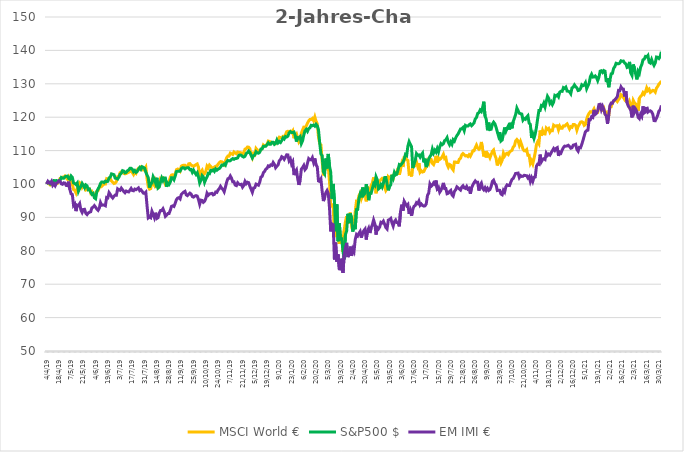
| Category | MSCI World € | S&P500 $ | EM IMI € |
|---|---|---|---|
| 2019-04-04 | 100 | 100 | 100 |
| 2019-04-05 | 100.413 | 100.482 | 100.778 |
| 2019-04-08 | 100.067 | 100.569 | 100.292 |
| 2019-04-09 | 99.679 | 100.034 | 100.222 |
| 2019-04-10 | 99.873 | 100.379 | 100.809 |
| 2019-04-11 | 99.96 | 100.36 | 99.603 |
| 2019-04-12 | 100.012 | 101.039 | 100.101 |
| 2019-04-15 | 100.135 | 100.971 | 99.475 |
| 2019-04-16 | 100.559 | 101.043 | 100.233 |
| 2019-04-17 | 100.254 | 100.796 | 100.443 |
| 2019-04-18 | 100.734 | 100.986 | 100.961 |
| 2019-04-23 | 101.698 | 101.084 | 100.805 |
| 2019-04-24 | 101.813 | 101.956 | 100.058 |
| 2019-04-25 | 102.059 | 101.756 | 99.911 |
| 2019-04-26 | 102.039 | 101.718 | 100.346 |
| 2019-04-29 | 102.376 | 102.184 | 100.284 |
| 2019-04-30 | 101.864 | 102.313 | 99.564 |
| 2019-05-02 | 101.412 | 102.377 | 99.502 |
| 2019-05-03 | 102.146 | 101.63 | 100.719 |
| 2019-05-06 | 101.285 | 101.429 | 98.359 |
| 2019-05-07 | 100.29 | 102.393 | 97.029 |
| 2019-05-08 | 99.956 | 101.987 | 96.862 |
| 2019-05-09 | 98.316 | 100.334 | 93.579 |
| 2019-05-10 | 98.124 | 100.136 | 94.027 |
| 2019-05-13 | 97.329 | 99.829 | 91.88 |
| 2019-05-14 | 98.719 | 100.296 | 93.684 |
| 2019-05-15 | 98.979 | 97.835 | 93.54 |
| 2019-05-16 | 100.401 | 98.684 | 94.135 |
| 2019-05-17 | 100.099 | 99.268 | 92.203 |
| 2019-05-20 | 99.016 | 100.178 | 91.472 |
| 2019-05-21 | 99.706 | 99.572 | 92.37 |
| 2019-05-22 | 99.607 | 98.893 | 92.42 |
| 2019-05-23 | 98.209 | 99.731 | 91.23 |
| 2019-05-24 | 98.36 | 99.458 | 90.842 |
| 2019-05-27 | 98.659 | 98.294 | 91.332 |
| 2019-05-28 | 98.578 | 98.464 | 91.549 |
| 2019-05-29 | 97.331 | 97.581 | 91.689 |
| 2019-05-30 | 97.703 | 96.91 | 92.868 |
| 2019-05-31 | 96.989 | 97.179 | 93.066 |
| 2019-06-03 | 96.43 | 95.879 | 93.525 |
| 2019-06-04 | 97.087 | 95.594 | 93.058 |
| 2019-06-05 | 97.808 | 97.698 | 92.49 |
| 2019-06-06 | 98.017 | 98.525 | 92.105 |
| 2019-06-07 | 98.911 | 99.166 | 92.732 |
| 2019-06-11 | 99.734 | 100.155 | 94.443 |
| 2019-06-12 | 99.322 | 100.626 | 93.634 |
| 2019-06-13 | 99.718 | 100.607 | 93.715 |
| 2019-06-14 | 99.952 | 100.417 | 93.673 |
| 2019-06-17 | 99.972 | 100.864 | 93.494 |
| 2019-06-18 | 101.523 | 100.713 | 95.971 |
| 2019-06-19 | 101.325 | 100.804 | 95.854 |
| 2019-06-20 | 101.718 | 101.809 | 97.422 |
| 2019-06-21 | 101.622 | 102.078 | 96.889 |
| 2019-06-24 | 100.857 | 103.029 | 96.216 |
| 2019-06-25 | 100.516 | 102.908 | 95.8 |
| 2019-06-26 | 100.143 | 102.775 | 96.309 |
| 2019-06-27 | 100.286 | 101.759 | 96.706 |
| 2019-06-28 | 100.77 | 101.661 | 96.652 |
| 2019-07-01 | 102.197 | 101.49 | 98.542 |
| 2019-07-02 | 102.32 | 102.051 | 98.266 |
| 2019-07-03 | 103.376 | 102.92 | 98.11 |
| 2019-07-04 | 103.625 | 103.219 | 98.775 |
| 2019-07-05 | 103.427 | 104.012 | 98.293 |
| 2019-07-08 | 103.205 | 103.879 | 97.752 |
| 2019-07-09 | 103.038 | 103.359 | 97.383 |
| 2019-07-10 | 103.126 | 103.488 | 97.904 |
| 2019-07-11 | 103.34 | 103.97 | 97.713 |
| 2019-07-12 | 103.502 | 104.178 | 97.616 |
| 2019-07-15 | 103.685 | 104.69 | 98.126 |
| 2019-07-16 | 104.014 | 104.717 | 98.674 |
| 2019-07-17 | 103.447 | 104.376 | 98.059 |
| 2019-07-18 | 102.832 | 103.67 | 97.974 |
| 2019-07-19 | 103.57 | 104.049 | 98.487 |
| 2019-07-22 | 103.221 | 103.492 | 98.293 |
| 2019-07-23 | 104.224 | 103.742 | 98.534 |
| 2019-07-24 | 104.665 | 104.455 | 98.829 |
| 2019-07-25 | 104.387 | 104.937 | 98.017 |
| 2019-07-26 | 105.061 | 104.425 | 98.297 |
| 2019-07-29 | 104.827 | 105.172 | 97.818 |
| 2019-07-30 | 104.22 | 104.982 | 97.254 |
| 2019-07-31 | 104.407 | 104.728 | 97.196 |
| 2019-08-01 | 105.037 | 103.541 | 97.55 |
| 2019-08-02 | 101.646 | 102.673 | 93.517 |
| 2019-08-05 | 99.163 | 101.922 | 89.838 |
| 2019-08-06 | 98.451 | 98.916 | 90.114 |
| 2019-08-07 | 98.618 | 100.19 | 89.893 |
| 2019-08-08 | 100.766 | 100.258 | 91.857 |
| 2019-08-09 | 100.143 | 102.214 | 91.001 |
| 2019-08-12 | 99.56 | 101.501 | 89.951 |
| 2019-08-13 | 100.75 | 100.311 | 91.398 |
| 2019-08-14 | 99.187 | 101.865 | 89.683 |
| 2019-08-15 | 98.989 | 98.798 | 89.932 |
| 2019-08-16 | 100.444 | 99.109 | 91.3 |
| 2019-08-19 | 101.634 | 100.561 | 92.039 |
| 2019-08-20 | 101.317 | 101.797 | 92.051 |
| 2019-08-21 | 101.801 | 101.009 | 92.599 |
| 2019-08-22 | 101.468 | 101.828 | 91.693 |
| 2019-08-23 | 99.873 | 101.79 | 90.309 |
| 2019-08-26 | 100.083 | 99.177 | 90.643 |
| 2019-08-27 | 100.567 | 100.277 | 91.164 |
| 2019-08-28 | 100.631 | 99.882 | 91.176 |
| 2019-08-29 | 102.051 | 100.576 | 92.164 |
| 2019-08-30 | 102.685 | 101.884 | 93.311 |
| 2019-09-02 | 102.765 | 101.843 | 93.467 |
| 2019-09-03 | 102.527 | 101.278 | 93.28 |
| 2019-09-04 | 103.026 | 102.362 | 94.221 |
| 2019-09-05 | 104.288 | 103.716 | 95.294 |
| 2019-09-06 | 104.478 | 103.792 | 95.784 |
| 2019-09-09 | 104.419 | 103.818 | 95.917 |
| 2019-09-10 | 103.923 | 103.841 | 95.536 |
| 2019-09-11 | 105.335 | 104.588 | 96.912 |
| 2019-09-12 | 105.557 | 104.895 | 97.282 |
| 2019-09-13 | 105.617 | 104.868 | 97.585 |
| 2019-09-16 | 105.621 | 104.523 | 97.803 |
| 2019-09-17 | 105.287 | 104.808 | 96.764 |
| 2019-09-18 | 105.113 | 104.872 | 96.516 |
| 2019-09-19 | 106.037 | 104.849 | 96.889 |
| 2019-09-20 | 106.116 | 104.288 | 97.274 |
| 2019-09-23 | 105.632 | 104.36 | 96.998 |
| 2019-09-24 | 105.494 | 103.496 | 96.228 |
| 2019-09-25 | 105.256 | 104.129 | 96.08 |
| 2019-09-26 | 105.561 | 103.431 | 96.387 |
| 2019-09-27 | 105.811 | 102.851 | 96.512 |
| 2019-09-30 | 106.001 | 103.359 | 96.383 |
| 2019-10-01 | 105.065 | 102.116 | 95.407 |
| 2019-10-02 | 102.221 | 100.315 | 93.941 |
| 2019-10-04 | 103.677 | 101.111 | 95.162 |
| 2019-10-07 | 104.149 | 102.514 | 95.084 |
| 2019-10-08 | 102.804 | 102.074 | 94.52 |
| 2019-10-09 | 103.074 | 100.489 | 94.839 |
| 2019-10-10 | 103.824 | 101.426 | 95.672 |
| 2019-10-11 | 105.339 | 102.116 | 97.258 |
| 2019-10-14 | 104.807 | 103.181 | 96.656 |
| 2019-10-15 | 105.648 | 103.086 | 97.021 |
| 2019-10-16 | 105.248 | 104.084 | 97.107 |
| 2019-10-17 | 104.915 | 103.921 | 97.2 |
| 2019-10-18 | 104.502 | 104.201 | 96.741 |
| 2019-10-21 | 105.069 | 103.773 | 96.897 |
| 2019-10-22 | 105.311 | 104.497 | 97.593 |
| 2019-10-23 | 105.315 | 104.129 | 97.492 |
| 2019-10-24 | 105.922 | 104.436 | 98.219 |
| 2019-10-25 | 106.354 | 104.607 | 98.619 |
| 2019-10-28 | 106.699 | 105.043 | 99.3 |
| 2019-10-29 | 106.695 | 105.653 | 98.701 |
| 2019-10-30 | 106.39 | 105.585 | 98.351 |
| 2019-10-31 | 105.906 | 105.957 | 97.674 |
| 2019-11-01 | 106.834 | 105.615 | 99.055 |
| 2019-11-04 | 107.846 | 106.62 | 100.541 |
| 2019-11-05 | 108.377 | 107.045 | 101.583 |
| 2019-11-06 | 108.353 | 106.908 | 101.684 |
| 2019-11-07 | 109.246 | 106.965 | 102.407 |
| 2019-11-08 | 109.04 | 107.344 | 101.754 |
| 2019-11-11 | 108.845 | 107.606 | 100.661 |
| 2019-11-12 | 109.583 | 107.397 | 100.665 |
| 2019-11-13 | 109.313 | 107.61 | 99.673 |
| 2019-11-14 | 109.067 | 107.655 | 99.518 |
| 2019-11-15 | 109.579 | 107.799 | 100.373 |
| 2019-11-18 | 109.476 | 108.603 | 99.969 |
| 2019-11-19 | 109.417 | 108.671 | 99.825 |
| 2019-11-20 | 109.305 | 108.618 | 99.926 |
| 2019-11-21 | 108.79 | 108.235 | 99.051 |
| 2019-11-22 | 109.313 | 108.069 | 99.572 |
| 2019-11-25 | 110.44 | 108.307 | 100.774 |
| 2019-11-26 | 110.587 | 109.13 | 100.093 |
| 2019-11-27 | 111.078 | 109.35 | 100.529 |
| 2019-11-28 | 111.031 | 109.866 | 100.401 |
| 2019-11-29 | 110.567 | 109.445 | 99.296 |
| 2019-12-02 | 108.762 | 108.554 | 98.409 |
| 2019-12-03 | 107.862 | 107.792 | 97.511 |
| 2019-12-04 | 109.151 | 108.482 | 98.818 |
| 2019-12-05 | 108.814 | 108.683 | 98.919 |
| 2019-12-06 | 110.654 | 109.65 | 99.969 |
| 2019-12-09 | 110.222 | 109.316 | 99.806 |
| 2019-12-10 | 109.762 | 109.214 | 99.638 |
| 2019-12-11 | 109.849 | 109.498 | 100.513 |
| 2019-12-12 | 110.368 | 110.461 | 102.069 |
| 2019-12-13 | 110.591 | 110.503 | 102.291 |
| 2019-12-16 | 111.673 | 111.284 | 103.387 |
| 2019-12-17 | 111.34 | 111.307 | 103.78 |
| 2019-12-18 | 111.634 | 111.314 | 104.457 |
| 2019-12-19 | 111.769 | 111.777 | 104.69 |
| 2019-12-20 | 112.848 | 112.345 | 105.413 |
| 2019-12-23 | 112.729 | 111.913 | 105.254 |
| 2019-12-27 | 112.578 | 111.913 | 105.732 |
| 2019-12-30 | 112.268 | 112.486 | 105.6 |
| 2020-01-02 | 112.451 | 112.486 | 106.448 |
| 2020-01-03 | 112.411 | 111.868 | 105.907 |
| 2020-01-06 | 112.153 | 112.156 | 104.865 |
| 2020-01-07 | 112.852 | 113.149 | 105.308 |
| 2020-01-08 | 113.316 | 112.323 | 105.682 |
| 2020-01-09 | 114.03 | 112.744 | 106.938 |
| 2020-01-10 | 113.915 | 112.433 | 107.37 |
| 2020-01-13 | 113.78 | 113.013 | 108.178 |
| 2020-01-14 | 114.268 | 113.794 | 107.957 |
| 2020-01-15 | 114.224 | 113.468 | 107.385 |
| 2020-01-16 | 114.724 | 114.219 | 108.038 |
| 2020-01-17 | 115.636 | 114.067 | 108.735 |
| 2020-01-20 | 115.791 | 114.321 | 108.715 |
| 2020-01-21 | 115.604 | 115.276 | 106.973 |
| 2020-01-22 | 115.815 | 115.667 | 107.529 |
| 2020-01-23 | 115.438 | 115.428 | 105.97 |
| 2020-01-24 | 115.961 | 115.458 | 106.658 |
| 2020-01-27 | 113.685 | 115.572 | 102.672 |
| 2020-01-28 | 114.656 | 114.518 | 103.679 |
| 2020-01-29 | 115.045 | 112.698 | 104.231 |
| 2020-01-30 | 113.736 | 113.919 | 101.668 |
| 2020-01-31 | 112.554 | 113.805 | 99.732 |
| 2020-02-03 | 113.101 | 114.162 | 101.081 |
| 2020-02-04 | 115.204 | 112.114 | 104.437 |
| 2020-02-05 | 116.175 | 112.929 | 104.931 |
| 2020-02-06 | 117.024 | 114.67 | 105.553 |
| 2020-02-07 | 117.008 | 115.966 | 104.293 |
| 2020-02-10 | 117.369 | 116.361 | 104.752 |
| 2020-02-11 | 118.194 | 115.769 | 106.215 |
| 2020-02-12 | 118.877 | 116.6 | 107.603 |
| 2020-02-13 | 119.333 | 116.812 | 107.268 |
| 2020-02-14 | 119.313 | 117.563 | 107.226 |
| 2020-02-17 | 119.61 | 117.449 | 107.898 |
| 2020-02-18 | 118.952 | 117.646 | 106.479 |
| 2020-02-19 | 120.09 | 117.324 | 107.661 |
| 2020-02-20 | 118.789 | 117.889 | 105.678 |
| 2020-02-21 | 118.032 | 117.426 | 105.153 |
| 2020-02-24 | 114.045 | 116.209 | 100.91 |
| 2020-02-25 | 112.102 | 112.323 | 100.751 |
| 2020-02-26 | 111.725 | 108.948 | 101.439 |
| 2020-02-27 | 106.953 | 108.467 | 97.83 |
| 2020-02-28 | 102.558 | 103.659 | 94.894 |
| 2020-03-02 | 103.998 | 103.033 | 95.843 |
| 2020-03-03 | 104.847 | 107.633 | 97.437 |
| 2020-03-04 | 105.831 | 104.664 | 98.059 |
| 2020-03-05 | 105.156 | 109.001 | 97.149 |
| 2020-03-06 | 100.615 | 105.35 | 92.821 |
| 2020-03-09 | 93.61 | 103.583 | 85.813 |
| 2020-03-10 | 93.34 | 95.59 | 88.065 |
| 2020-03-11 | 93.757 | 100.027 | 87.812 |
| 2020-03-12 | 84.713 | 95.067 | 77.396 |
| 2020-03-13 | 86.655 | 85.872 | 82.457 |
| 2020-03-16 | 84.134 | 93.896 | 76.719 |
| 2020-03-17 | 85.34 | 82.873 | 78.945 |
| 2020-03-18 | 82.063 | 88.299 | 74.592 |
| 2020-03-19 | 84.36 | 83.472 | 74.522 |
| 2020-03-20 | 84.368 | 83.544 | 77.662 |
| 2020-03-23 | 79.701 | 79.904 | 73.386 |
| 2020-03-24 | 86.252 | 77.451 | 78.887 |
| 2020-03-25 | 88.662 | 84.837 | 80.793 |
| 2020-03-26 | 90.357 | 85.926 | 82.364 |
| 2020-03-27 | 88.17 | 91.09 | 78.117 |
| 2020-03-30 | 89.862 | 88.291 | 79.132 |
| 2020-03-31 | 91.446 | 91.147 | 81.271 |
| 2020-04-01 | 87.755 | 89.793 | 78.463 |
| 2020-04-02 | 88.372 | 85.747 | 80.52 |
| 2020-04-03 | 87.966 | 87.753 | 79.778 |
| 2020-04-06 | 91.797 | 86.456 | 83.367 |
| 2020-04-07 | 94.772 | 92.337 | 84.849 |
| 2020-04-08 | 94.58 | 92.386 | 84.46 |
| 2020-04-09 | 96.488 | 95.522 | 85.238 |
| 2020-04-14 | 97.192 | 96.94 | 85.79 |
| 2020-04-15 | 95.583 | 96 | 83.919 |
| 2020-04-16 | 96.644 | 98.931 | 85.436 |
| 2020-04-17 | 98.005 | 96.777 | 86.012 |
| 2020-04-20 | 98.975 | 97.266 | 86.498 |
| 2020-04-21 | 94.816 | 99.951 | 83.371 |
| 2020-04-22 | 96.962 | 98.15 | 86 |
| 2020-04-23 | 98.269 | 95.151 | 86.785 |
| 2020-04-24 | 97.473 | 97.243 | 85.335 |
| 2020-04-27 | 99.627 | 97.225 | 86.832 |
| 2020-04-28 | 100.373 | 98.635 | 87.851 |
| 2020-04-29 | 101.979 | 100.061 | 89.235 |
| 2020-04-30 | 100.266 | 99.598 | 88.077 |
| 2020-05-04 | 97.212 | 102.165 | 84.853 |
| 2020-05-05 | 100.147 | 101.274 | 86.941 |
| 2020-05-06 | 99.738 | 98.514 | 86.56 |
| 2020-05-07 | 100.853 | 98.825 | 87.12 |
| 2020-05-08 | 101.361 | 99.735 | 88.543 |
| 2020-05-11 | 101.718 | 99.063 | 88.368 |
| 2020-05-12 | 101.495 | 100.235 | 88.885 |
| 2020-05-13 | 99.127 | 101.911 | 87.979 |
| 2020-05-14 | 98.033 | 101.926 | 86.949 |
| 2020-05-15 | 98.606 | 99.875 | 86.548 |
| 2020-05-18 | 102.182 | 98.104 | 89.193 |
| 2020-05-19 | 101.817 | 99.287 | 89.34 |
| 2020-05-20 | 102.217 | 99.735 | 89.698 |
| 2020-05-21 | 101.301 | 102.783 | 88.392 |
| 2020-05-22 | 101.424 | 101.812 | 87.384 |
| 2020-05-25 | 103.431 | 103.473 | 88.745 |
| 2020-05-26 | 103.491 | 102.73 | 89.216 |
| 2020-05-27 | 103.193 | 102.961 | 88.462 |
| 2020-05-28 | 104.744 | 104.285 | 88.36 |
| 2020-05-29 | 102.765 | 105.805 | 87.318 |
| 2020-06-02 | 104.49 | 105.596 | 91.775 |
| 2020-06-03 | 106.132 | 106.07 | 93.828 |
| 2020-06-04 | 105.093 | 106.533 | 92.016 |
| 2020-06-05 | 108 | 107.409 | 94.8 |
| 2020-06-08 | 108.088 | 108.827 | 94.104 |
| 2020-06-09 | 107.287 | 108.55 | 93.482 |
| 2020-06-10 | 107.045 | 111.326 | 93.883 |
| 2020-06-11 | 102.991 | 112.675 | 91.048 |
| 2020-06-12 | 103.161 | 111.875 | 92.094 |
| 2020-06-15 | 102.257 | 111.178 | 90.468 |
| 2020-06-16 | 105.609 | 104.77 | 92.44 |
| 2020-06-17 | 106.279 | 106.032 | 93.33 |
| 2020-06-18 | 105.791 | 106.999 | 93.575 |
| 2020-06-19 | 106.64 | 109.092 | 94.412 |
| 2020-06-22 | 105.299 | 108.592 | 94.139 |
| 2020-06-23 | 106.263 | 108.69 | 94.902 |
| 2020-06-24 | 103.51 | 108.05 | 93.599 |
| 2020-06-25 | 103.947 | 108.766 | 93.999 |
| 2020-06-26 | 103.594 | 109.259 | 93.568 |
| 2020-06-29 | 103.732 | 106.465 | 93.389 |
| 2020-06-30 | 104.514 | 107.591 | 93.47 |
| 2020-07-01 | 105.156 | 105.069 | 94.058 |
| 2020-07-02 | 106.795 | 106.051 | 96.589 |
| 2020-07-03 | 106.077 | 107.466 | 97.254 |
| 2020-07-06 | 107.54 | 108.201 | 100 |
| 2020-07-07 | 107.374 | 108.747 | 99.319 |
| 2020-07-08 | 106.172 | 110.435 | 99.666 |
| 2020-07-09 | 105.795 | 109.289 | 100.342 |
| 2020-07-10 | 106.783 | 110.101 | 99.922 |
| 2020-07-13 | 108.433 | 109.54 | 101.05 |
| 2020-07-14 | 106.446 | 110.639 | 98.549 |
| 2020-07-15 | 107.822 | 109.638 | 98.95 |
| 2020-07-16 | 107.338 | 111.106 | 97.538 |
| 2020-07-17 | 107.616 | 112.091 | 98.102 |
| 2020-07-20 | 108.179 | 111.765 | 99.109 |
| 2020-07-21 | 108.905 | 112.061 | 100.327 |
| 2020-07-22 | 107.62 | 112.994 | 98.654 |
| 2020-07-23 | 107.874 | 113.229 | 98.647 |
| 2020-07-24 | 105.878 | 113.874 | 97.083 |
| 2020-07-27 | 105.049 | 112.512 | 97.219 |
| 2020-07-28 | 105.855 | 111.784 | 97.729 |
| 2020-07-29 | 105.648 | 112.6 | 98.087 |
| 2020-07-30 | 104.661 | 111.902 | 96.761 |
| 2020-07-31 | 104.185 | 113.255 | 96.364 |
| 2020-08-03 | 106.565 | 112.842 | 97.776 |
| 2020-08-04 | 106.573 | 113.786 | 98.25 |
| 2020-08-05 | 106.426 | 114.503 | 99.148 |
| 2020-08-06 | 106.434 | 114.984 | 98.849 |
| 2020-08-07 | 107.405 | 115.701 | 98.511 |
| 2020-08-10 | 107.727 | 116.478 | 98.188 |
| 2020-08-11 | 108.758 | 116.539 | 99.082 |
| 2020-08-12 | 109.111 | 116.911 | 99.479 |
| 2020-08-13 | 108.806 | 115.966 | 98.837 |
| 2020-08-14 | 108.413 | 117.555 | 98.674 |
| 2020-08-17 | 108.504 | 117.354 | 99.265 |
| 2020-08-18 | 108.207 | 117.354 | 98.468 |
| 2020-08-19 | 108.754 | 117.733 | 98.705 |
| 2020-08-20 | 108.302 | 117.98 | 97.083 |
| 2020-08-21 | 109.032 | 117.479 | 98.857 |
| 2020-08-24 | 109.94 | 117.851 | 99.677 |
| 2020-08-25 | 109.96 | 118.272 | 100.381 |
| 2020-08-26 | 110.86 | 119.474 | 100.914 |
| 2020-08-27 | 111.654 | 119.891 | 100.502 |
| 2020-08-28 | 110.765 | 121.115 | 100.506 |
| 2020-08-31 | 110.396 | 121.358 | 98.028 |
| 2020-09-01 | 110.761 | 122.147 | 99.669 |
| 2020-09-02 | 112.59 | 121.718 | 100.261 |
| 2020-09-03 | 110.527 | 122.856 | 98.709 |
| 2020-09-04 | 108.242 | 124.645 | 98.25 |
| 2020-09-07 | 109.825 | 120.331 | 98.888 |
| 2020-09-08 | 107.953 | 119.368 | 98.094 |
| 2020-09-09 | 109.182 | 116.088 | 98.709 |
| 2020-09-10 | 108.683 | 118.378 | 98.059 |
| 2020-09-11 | 107.842 | 116.308 | 98.347 |
| 2020-09-14 | 108.826 | 116.395 | 99.288 |
| 2020-09-15 | 109.777 | 117.908 | 100.766 |
| 2020-09-16 | 110.178 | 118.514 | 101.136 |
| 2020-09-17 | 108.627 | 118.037 | 100.152 |
| 2020-09-18 | 107.751 | 117.005 | 99.774 |
| 2020-09-21 | 105.553 | 115.644 | 98.048 |
| 2020-09-22 | 106.739 | 114.389 | 98.118 |
| 2020-09-23 | 107.576 | 115.546 | 98.098 |
| 2020-09-24 | 106.279 | 112.869 | 97.002 |
| 2020-09-25 | 107.096 | 113.18 | 96.776 |
| 2020-09-28 | 109.238 | 114.992 | 98.122 |
| 2020-09-29 | 108.389 | 116.918 | 97.589 |
| 2020-09-30 | 109.016 | 115.758 | 99.141 |
| 2020-10-01 | 109.218 | 116.649 | 99.755 |
| 2020-10-02 | 108.845 | 117.388 | 99.564 |
| 2020-10-05 | 109.555 | 116.296 | 99.529 |
| 2020-10-06 | 109.869 | 118.329 | 100.521 |
| 2020-10-07 | 110.083 | 116.676 | 101.361 |
| 2020-10-08 | 111.063 | 118.677 | 101.664 |
| 2020-10-09 | 111.439 | 119.728 | 102.427 |
| 2020-10-12 | 112.927 | 120.793 | 103.166 |
| 2020-10-13 | 113.328 | 122.742 | 103.197 |
| 2020-10-14 | 112.875 | 121.957 | 103.274 |
| 2020-10-15 | 111.638 | 121.195 | 101.948 |
| 2020-10-16 | 112.709 | 121.051 | 102.532 |
| 2020-10-19 | 111.666 | 120.949 | 102.271 |
| 2020-10-20 | 110.424 | 119.121 | 102.302 |
| 2020-10-21 | 109.932 | 119.591 | 102.606 |
| 2020-10-22 | 109.908 | 119.375 | 102.52 |
| 2020-10-23 | 110.305 | 120.031 | 102.481 |
| 2020-10-26 | 108.584 | 120.441 | 101.824 |
| 2020-10-27 | 108.584 | 118.222 | 102.252 |
| 2020-10-28 | 106.196 | 117.832 | 100.747 |
| 2020-10-29 | 106.969 | 113.775 | 101.82 |
| 2020-10-30 | 106.025 | 114.973 | 100.805 |
| 2020-11-02 | 107.636 | 113.68 | 102.034 |
| 2020-11-03 | 109.46 | 115.003 | 102.104 |
| 2020-11-04 | 111.856 | 117.032 | 105.371 |
| 2020-11-05 | 112.637 | 119.667 | 105.966 |
| 2020-11-06 | 112.03 | 122.01 | 105.853 |
| 2020-11-09 | 116.013 | 121.995 | 108.797 |
| 2020-11-10 | 114.414 | 123.516 | 106.662 |
| 2020-11-11 | 116.001 | 123.356 | 107.315 |
| 2020-11-12 | 115.029 | 124.225 | 107.556 |
| 2020-11-13 | 114.974 | 123.076 | 107.331 |
| 2020-11-16 | 116.731 | 124.748 | 109.201 |
| 2020-11-17 | 116.334 | 126.261 | 108.556 |
| 2020-11-18 | 116.64 | 125.631 | 108.937 |
| 2020-11-19 | 115.537 | 124.107 | 108.649 |
| 2020-11-20 | 116.088 | 124.627 | 109.361 |
| 2020-11-23 | 115.993 | 123.792 | 109.987 |
| 2020-11-24 | 117.607 | 124.524 | 110.621 |
| 2020-11-25 | 117.302 | 126.541 | 110.057 |
| 2020-11-26 | 117.421 | 126.333 | 110.644 |
| 2020-11-27 | 117.461 | 126.693 | 110.885 |
| 2020-11-30 | 116.195 | 126.124 | 108.451 |
| 2020-12-01 | 117.314 | 127.512 | 109.528 |
| 2020-12-02 | 116.679 | 127.781 | 109.267 |
| 2020-12-03 | 116.691 | 127.743 | 110.177 |
| 2020-12-04 | 117.397 | 128.843 | 110.928 |
| 2020-12-07 | 117.342 | 128.604 | 111.34 |
| 2020-12-08 | 117.726 | 128.976 | 111.328 |
| 2020-12-09 | 118.008 | 127.83 | 111.406 |
| 2020-12-10 | 117.278 | 127.77 | 111.585 |
| 2020-12-11 | 116.481 | 127.607 | 111.239 |
| 2020-12-14 | 117.163 | 127.023 | 110.726 |
| 2020-12-15 | 116.993 | 128.778 | 110.85 |
| 2020-12-16 | 117.83 | 128.976 | 111.636 |
| 2020-12-17 | 117.837 | 129.677 | 111.713 |
| 2020-12-18 | 117.508 | 129.158 | 111.885 |
| 2020-12-21 | 116.112 | 128.759 | 110.341 |
| 2020-12-22 | 117.246 | 127.982 | 109.82 |
| 2020-12-23 | 117.826 | 128.084 | 110.94 |
| 2020-12-28 | 118.528 | 128.596 | 110.854 |
| 2020-12-29 | 118.639 | 129.715 | 111.877 |
| 2020-12-30 | 118.424 | 129.442 | 113.067 |
| 2021-01-04 | 117.556 | 129.616 | 114.42 |
| 2021-01-05 | 117.83 | 130.314 | 115.665 |
| 2021-01-06 | 119.468 | 128.547 | 115.987 |
| 2021-01-07 | 120.523 | 129.393 | 116.116 |
| 2021-01-08 | 121.193 | 130.177 | 119.27 |
| 2021-01-11 | 121.641 | 132.123 | 119.254 |
| 2021-01-12 | 121.538 | 132.866 | 120.125 |
| 2021-01-13 | 121.852 | 131.997 | 119.927 |
| 2021-01-14 | 122.494 | 132.009 | 122.198 |
| 2021-01-15 | 121.419 | 132.339 | 120.849 |
| 2021-01-18 | 121.681 | 131.891 | 121.156 |
| 2021-01-19 | 121.55 | 130.951 | 121.906 |
| 2021-01-20 | 123.125 | 131.986 | 123.781 |
| 2021-01-21 | 123.061 | 133.779 | 123.878 |
| 2021-01-22 | 122.216 | 133.905 | 122.291 |
| 2021-01-25 | 122.066 | 133.427 | 123.283 |
| 2021-01-26 | 122.629 | 133.969 | 122.404 |
| 2021-01-27 | 121.138 | 133.768 | 120.856 |
| 2021-01-28 | 121.403 | 130.522 | 120.429 |
| 2021-01-29 | 118.928 | 131.618 | 118.014 |
| 2021-02-01 | 120.483 | 128.983 | 120.611 |
| 2021-02-02 | 123.073 | 131.103 | 123.547 |
| 2021-02-03 | 123.117 | 132.987 | 124.24 |
| 2021-02-04 | 124.319 | 133.12 | 124.177 |
| 2021-02-05 | 124.707 | 134.61 | 124.951 |
| 2021-02-08 | 125.179 | 135.148 | 125.196 |
| 2021-02-09 | 125.14 | 136.145 | 125.648 |
| 2021-02-10 | 124.688 | 136.035 | 126.157 |
| 2021-02-11 | 125.255 | 135.982 | 128.012 |
| 2021-02-12 | 125.687 | 136.202 | 127.95 |
| 2021-02-15 | 126.754 | 136.896 | 129.081 |
| 2021-02-16 | 126.484 | 136.767 | 128.506 |
| 2021-02-17 | 125.901 | 136.798 | 128.42 |
| 2021-02-18 | 125.259 | 136.214 | 126.204 |
| 2021-02-19 | 125.731 | 135.963 | 127.748 |
| 2021-02-22 | 124.513 | 134.894 | 124.314 |
| 2021-02-23 | 123.593 | 135.065 | 123.337 |
| 2021-02-24 | 124.656 | 136.559 | 122.82 |
| 2021-02-25 | 123.498 | 133.283 | 122.039 |
| 2021-02-26 | 122.74 | 132.551 | 119.919 |
| 2021-03-01 | 125.049 | 135.785 | 123.442 |
| 2021-03-02 | 124.307 | 134.735 | 121.506 |
| 2021-03-03 | 123.954 | 132.957 | 122.377 |
| 2021-03-04 | 123.161 | 131.319 | 121.696 |
| 2021-03-05 | 121.911 | 133.726 | 119.97 |
| 2021-03-08 | 125.652 | 133.07 | 119.569 |
| 2021-03-09 | 126.203 | 134.932 | 120.915 |
| 2021-03-10 | 126.584 | 135.766 | 120.246 |
| 2021-03-11 | 127.357 | 137.2 | 123.244 |
| 2021-03-12 | 126.873 | 137.393 | 121.296 |
| 2021-03-15 | 127.583 | 138.189 | 121.576 |
| 2021-03-16 | 128.797 | 138.034 | 123.065 |
| 2021-03-17 | 127.984 | 138.485 | 121.541 |
| 2021-03-18 | 128.384 | 136.449 | 121.821 |
| 2021-03-19 | 127.44 | 136.206 | 121.91 |
| 2021-03-22 | 127.734 | 137.283 | 121.626 |
| 2021-03-23 | 128.051 | 136.274 | 120.868 |
| 2021-03-24 | 127.944 | 135.52 | 118.994 |
| 2021-03-25 | 127.504 | 136.282 | 118.935 |
| 2021-03-26 | 128.718 | 138.019 | 119.697 |
| 2021-03-29 | 129.217 | 137.935 | 120.604 |
| 2021-03-30 | 129.943 | 137.582 | 121.844 |
| 2021-03-31 | 130.288 | 138.128 | 122.198 |
| 2021-04-01 | 130.816 | 139.592 | 123.516 |